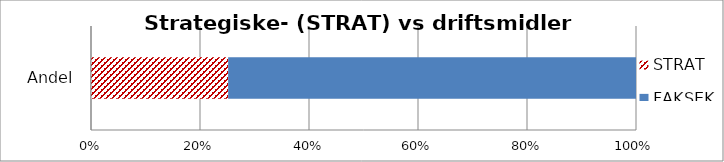
| Category | STRAT | FAKSEK |
|---|---|---|
| 0 | 9388784.597 | 27922989 |